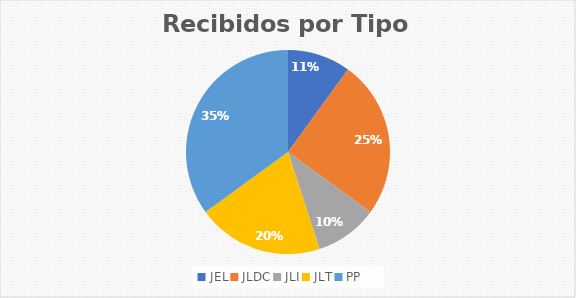
| Category | Series 0 |
|---|---|
| JEL | 2 |
| JLDC | 5 |
| JLI | 2 |
| JLT | 4 |
| PP | 7 |